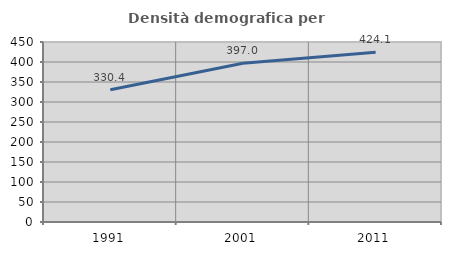
| Category | Densità demografica |
|---|---|
| 1991.0 | 330.395 |
| 2001.0 | 397.029 |
| 2011.0 | 424.099 |